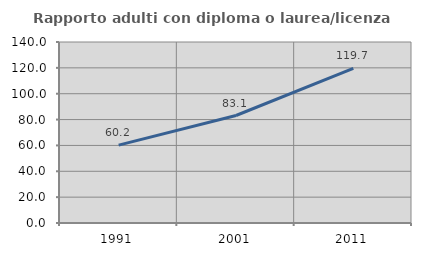
| Category | Rapporto adulti con diploma o laurea/licenza media  |
|---|---|
| 1991.0 | 60.204 |
| 2001.0 | 83.148 |
| 2011.0 | 119.672 |